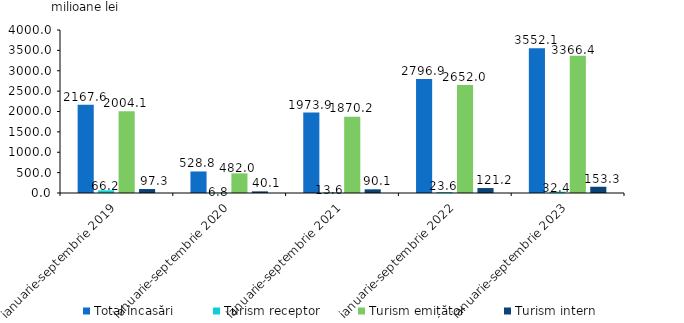
| Category | Total încasări | Turism receptor | Turism emițător | Turism intern |
|---|---|---|---|---|
| ianuarie-septembrie 2019 | 2167.6 | 66.2 | 2004.1 | 97.3 |
| ianuarie-septembrie 2020 | 528.8 | 6.8 | 482 | 40.1 |
| ianuarie-septembrie 2021 | 1973.9 | 13.6 | 1870.2 | 90.1 |
| ianuarie-septembrie 2022 | 2796.9 | 23.6 | 2652 | 121.2 |
| ianuarie-septembrie 2023 | 3552.1 | 32.4 | 3366.4 | 153.3 |